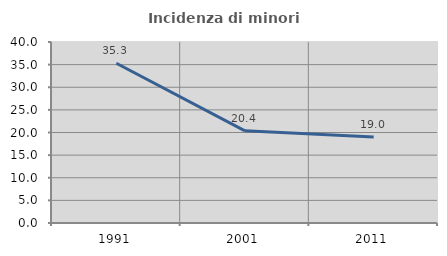
| Category | Incidenza di minori stranieri |
|---|---|
| 1991.0 | 35.294 |
| 2001.0 | 20.37 |
| 2011.0 | 18.994 |